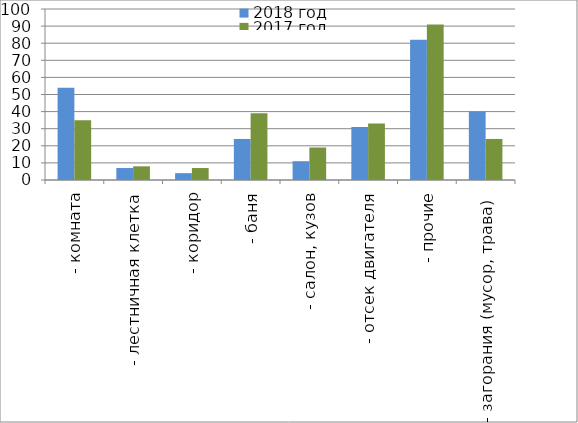
| Category | 2018 год | 2017 год |
|---|---|---|
|  - комната | 54 | 35 |
|  - лестничная клетка | 7 | 8 |
|  - коридор | 4 | 7 |
|  - баня | 24 | 39 |
|  - салон, кузов | 11 | 19 |
|  - отсек двигателя | 31 | 33 |
| - прочие | 82 | 91 |
| - загорания (мусор, трава)  | 40 | 24 |